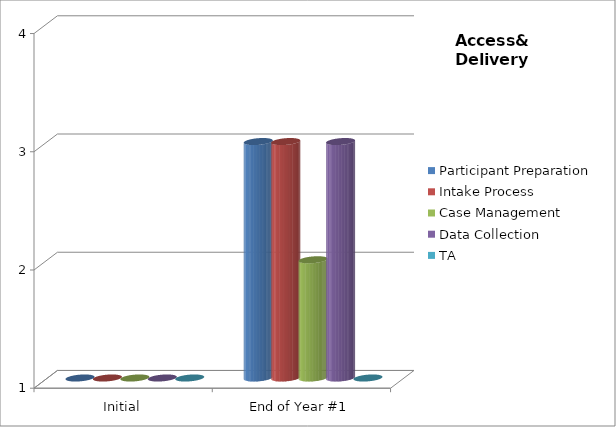
| Category | Participant Preparation  | Intake Process  | Case Management  | Data Collection  | TA |
|---|---|---|---|---|---|
| Initial | 1 | 1 | 1 | 1 | 1 |
| End of Year #1 | 3 | 3 | 2 | 3 | 1 |